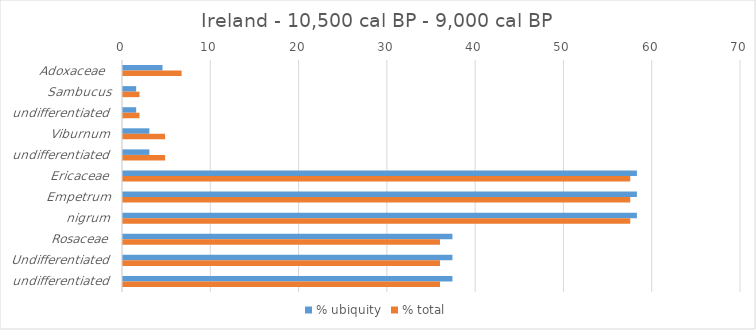
| Category | % ubiquity | % total |
|---|---|---|
| Adoxaceae  | 4.478 | 6.639 |
| Sambucus | 1.493 | 1.871 |
| undifferentiated | 1.493 | 1.871 |
| Viburnum | 2.985 | 4.768 |
| undifferentiated | 2.985 | 4.768 |
| Ericaceae | 58.209 | 57.454 |
| Empetrum | 58.209 | 57.454 |
| nigrum | 58.209 | 57.454 |
| Rosaceae | 37.313 | 35.907 |
| Undifferentiated | 37.313 | 35.907 |
| undifferentiated | 37.313 | 35.907 |